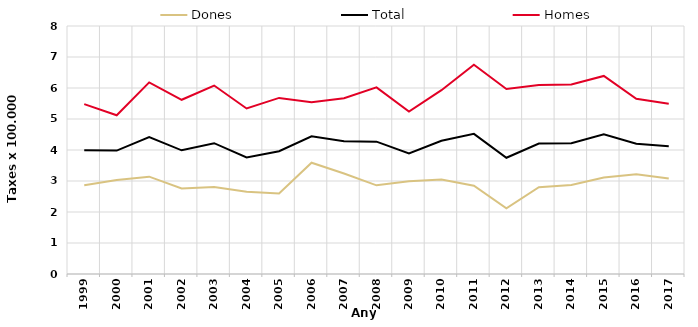
| Category | Dones | Total | Homes |
|---|---|---|---|
| 1999.0 | 2.86 | 3.99 | 5.48 |
| 2000.0 | 3.03 | 3.98 | 5.12 |
| 2001.0 | 3.14 | 4.42 | 6.18 |
| 2002.0 | 2.76 | 3.99 | 5.62 |
| 2003.0 | 2.81 | 4.22 | 6.08 |
| 2004.0 | 2.65 | 3.76 | 5.34 |
| 2005.0 | 2.6 | 3.96 | 5.68 |
| 2006.0 | 3.59 | 4.44 | 5.54 |
| 2007.0 | 3.24 | 4.28 | 5.67 |
| 2008.0 | 2.86 | 4.27 | 6.02 |
| 2009.0 | 2.99 | 3.89 | 5.24 |
| 2010.0 | 3.05 | 4.3 | 5.93 |
| 2011.0 | 2.85 | 4.52 | 6.75 |
| 2012.0 | 2.12 | 3.75 | 5.97 |
| 2013.0 | 2.8 | 4.21 | 6.1 |
| 2014.0 | 2.87 | 4.22 | 6.11 |
| 2015.0 | 3.11 | 4.51 | 6.39 |
| 2016.0 | 3.22 | 4.2 | 5.65 |
| 2017.0 | 3.08 | 4.12 | 5.49 |